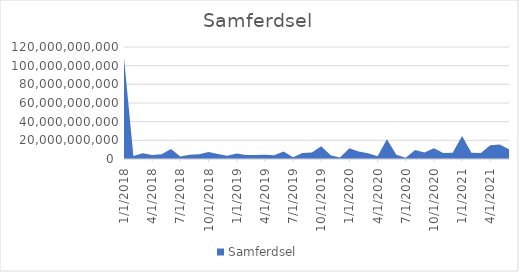
| Category | Samferdsel |
|---|---|
| 1/1/18 | 108327450000 |
| 2/1/18 | 3155250000 |
| 3/1/18 | 6084000000 |
| 4/1/18 | 4184575000 |
| 5/1/18 | 5180950000 |
| 6/1/18 | 10640400000 |
| 7/1/18 | 2636000000 |
| 8/1/18 | 4450550000 |
| 9/1/18 | 5154200000 |
| 10/1/18 | 7524600000 |
| 11/1/18 | 5441900000 |
| 12/1/18 | 3538500000 |
| 1/1/19 | 5968740000 |
| 2/1/19 | 4343000000 |
| 3/1/19 | 4195750000 |
| 4/1/19 | 4570900000 |
| 5/1/19 | 4066500000 |
| 6/1/19 | 7935750000 |
| 7/1/19 | 1787000000 |
| 8/1/19 | 6508500000 |
| 9/1/19 | 6907500000 |
| 10/1/19 | 13542700000 |
| 11/1/19 | 3887000000 |
| 12/1/19 | 1579000000 |
| 1/1/20 | 11540900000 |
| 2/1/20 | 8152700000 |
| 3/1/20 | 6135500000 |
| 4/1/20 | 3054200000 |
| 5/1/20 | 21181500000 |
| 6/1/20 | 4577350000 |
| 7/1/20 | 1341000000 |
| 8/1/20 | 9701800000 |
| 9/1/20 | 6996000000 |
| 10/1/20 | 11489750000 |
| 11/1/20 | 6454700000 |
| 12/1/20 | 6629500000 |
| 1/1/21 | 24518100000 |
| 2/1/21 | 6816300000 |
| 3/1/21 | 6489200000 |
| 4/1/21 | 14788400000 |
| 5/1/21 | 15616300000 |
| 6/1/21 | 10470600000 |